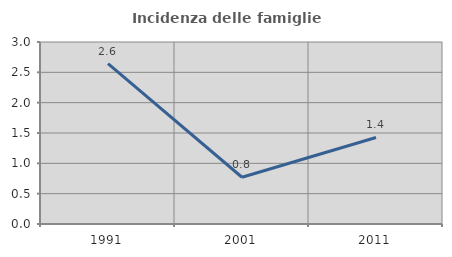
| Category | Incidenza delle famiglie numerose |
|---|---|
| 1991.0 | 2.644 |
| 2001.0 | 0.771 |
| 2011.0 | 1.427 |